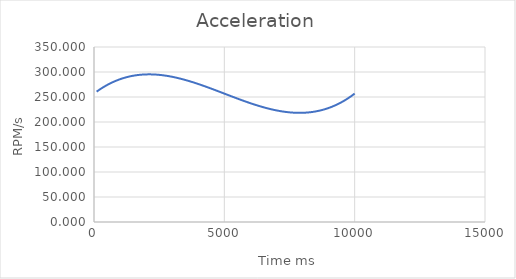
| Category | Series 0 |
|---|---|
| 100.0 | 260.681 |
| 200.0 | 264.326 |
| 300.0 | 267.742 |
| 400.0 | 270.931 |
| 500.0 | 273.9 |
| 600.0 | 276.653 |
| 700.0 | 279.194 |
| 800.0 | 281.53 |
| 900.0 | 283.663 |
| 1000.0 | 285.6 |
| 1100.0 | 287.345 |
| 1200.0 | 288.902 |
| 1300.0 | 290.278 |
| 1400.0 | 291.475 |
| 1500.0 | 292.5 |
| 1600.0 | 293.357 |
| 1700.0 | 294.05 |
| 1800.0 | 294.586 |
| 1900.0 | 294.967 |
| 2000.0 | 295.2 |
| 2100.0 | 295.289 |
| 2200.0 | 295.238 |
| 2300.0 | 295.054 |
| 2400.0 | 294.739 |
| 2500.0 | 294.3 |
| 2600.0 | 293.741 |
| 2700.0 | 293.066 |
| 2800.0 | 292.282 |
| 2900.0 | 291.391 |
| 3000.0 | 290.4 |
| 3100.0 | 289.313 |
| 3200.0 | 288.134 |
| 3300.0 | 286.87 |
| 3400.0 | 285.523 |
| 3500.0 | 284.1 |
| 3600.0 | 282.605 |
| 3700.0 | 281.042 |
| 3800.0 | 279.418 |
| 3900.0 | 277.735 |
| 4000.0 | 276 |
| 4100.0 | 274.217 |
| 4200.0 | 272.39 |
| 4300.0 | 270.526 |
| 4400.0 | 268.627 |
| 4500.0 | 266.7 |
| 4600.0 | 264.749 |
| 4700.0 | 262.778 |
| 4800.0 | 260.794 |
| 4900.0 | 258.799 |
| 5000.0 | 256.8 |
| 5100.0 | 254.801 |
| 5200.0 | 252.806 |
| 5300.0 | 250.822 |
| 5400.0 | 248.851 |
| 5500.0 | 246.9 |
| 5600.0 | 244.973 |
| 5700.0 | 243.074 |
| 5800.0 | 241.21 |
| 5900.0 | 239.383 |
| 6000.0 | 237.6 |
| 6100.0 | 235.865 |
| 6200.0 | 234.182 |
| 6300.0 | 232.558 |
| 6400.0 | 230.995 |
| 6500.0 | 229.5 |
| 6600.0 | 228.077 |
| 6700.0 | 226.73 |
| 6800.0 | 225.466 |
| 6900.0 | 224.287 |
| 7000.0 | 223.2 |
| 7100.0 | 222.209 |
| 7200.0 | 221.318 |
| 7300.0 | 220.534 |
| 7400.0 | 219.859 |
| 7500.0 | 219.3 |
| 7600.0 | 218.861 |
| 7700.0 | 218.546 |
| 7800.0 | 218.362 |
| 7900.0 | 218.311 |
| 8000.0 | 218.4 |
| 8100.0 | 218.633 |
| 8200.0 | 219.014 |
| 8300.0 | 219.55 |
| 8400.0 | 220.243 |
| 8500.0 | 221.1 |
| 8600.0 | 222.125 |
| 8700.0 | 223.322 |
| 8800.0 | 224.698 |
| 8900.0 | 226.255 |
| 9000.0 | 228 |
| 9100.0 | 229.937 |
| 9200.0 | 232.07 |
| 9300.0 | 234.406 |
| 9400.0 | 236.947 |
| 9500.0 | 239.7 |
| 9600.0 | 242.669 |
| 9700.0 | 245.858 |
| 9800.0 | 249.274 |
| 9900.0 | 252.919 |
| 10000.0 | 256.8 |